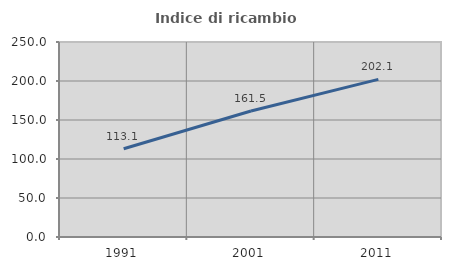
| Category | Indice di ricambio occupazionale  |
|---|---|
| 1991.0 | 113.084 |
| 2001.0 | 161.458 |
| 2011.0 | 202.128 |